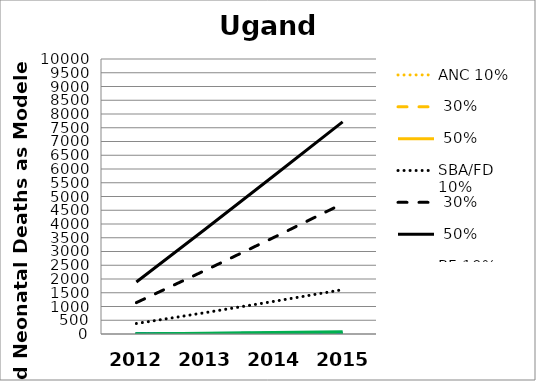
| Category | ANC 10% | ANC 30% | ANC 50% | SBA/FD 10% | SBA/FD 30% | SBA/FD 50% | BF 10% | BF 30% | BF 50% | PNC 10% | PNC 30% | PNC 50% |
|---|---|---|---|---|---|---|---|---|---|---|---|---|
| 2012.0 | 1 | 3 | 5 | 381 | 1141 | 1892 | 2 | 5 | 8 | 0 | 0 | 0 |
| 2013.0 | 2 | 7 | 11 | 776 | 2312 | 3811 | 3 | 8 | 16 | 6 | 15 | 26 |
| 2014.0 | 3 | 10 | 17 | 1187 | 3512 | 5753 | 5 | 14 | 26 | 12 | 30 | 54 |
| 2015.0 | 5 | 14 | 23 | 1611 | 4738 | 7714 | 7 | 18 | 35 | 17 | 47 | 83 |